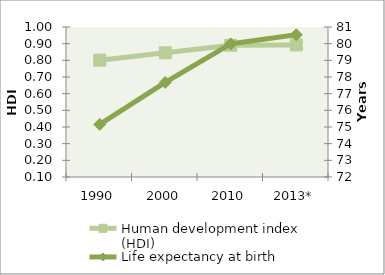
| Category | Human development index (HDI) |
|---|---|
| 1990 | 0.801 |
| 2000 | 0.845 |
| 2010 | 0.89 |
| 2013* | 0.892 |